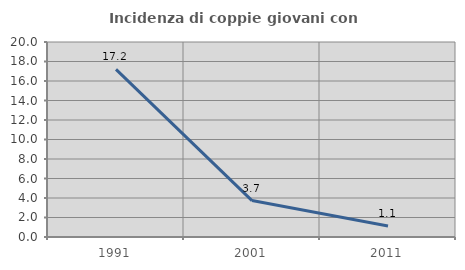
| Category | Incidenza di coppie giovani con figli |
|---|---|
| 1991.0 | 17.188 |
| 2001.0 | 3.738 |
| 2011.0 | 1.136 |